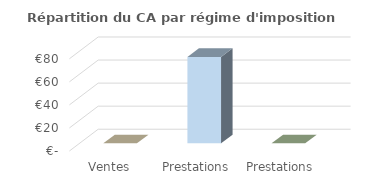
| Category | Series 0 |
|---|---|
| Ventes | 0 |
| Prestations BIC | 75 |
| Prestations BNC | 0 |